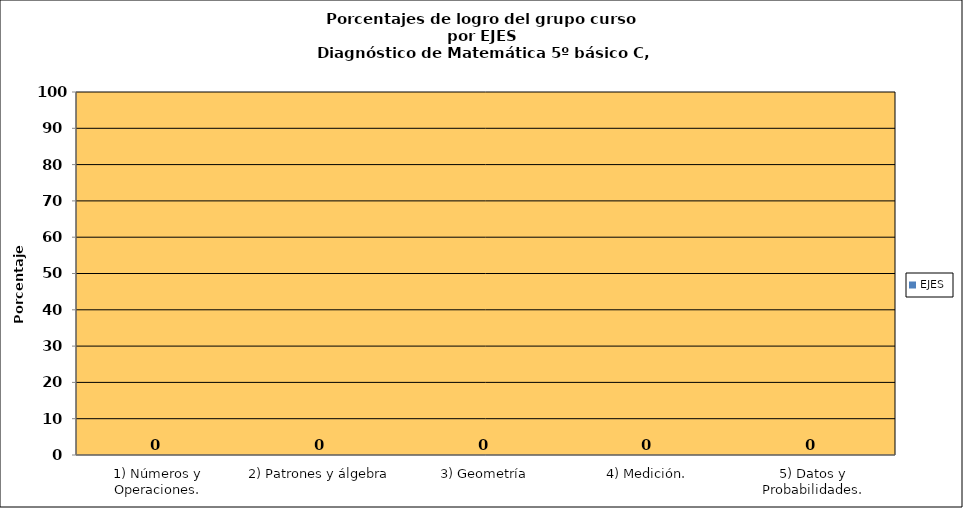
| Category | EJES |
|---|---|
| 1) Números y Operaciones. | 0 |
| 2) Patrones y álgebra | 0 |
| 3) Geometría | 0 |
| 4) Medición. | 0 |
| 5) Datos y Probabilidades. | 0 |